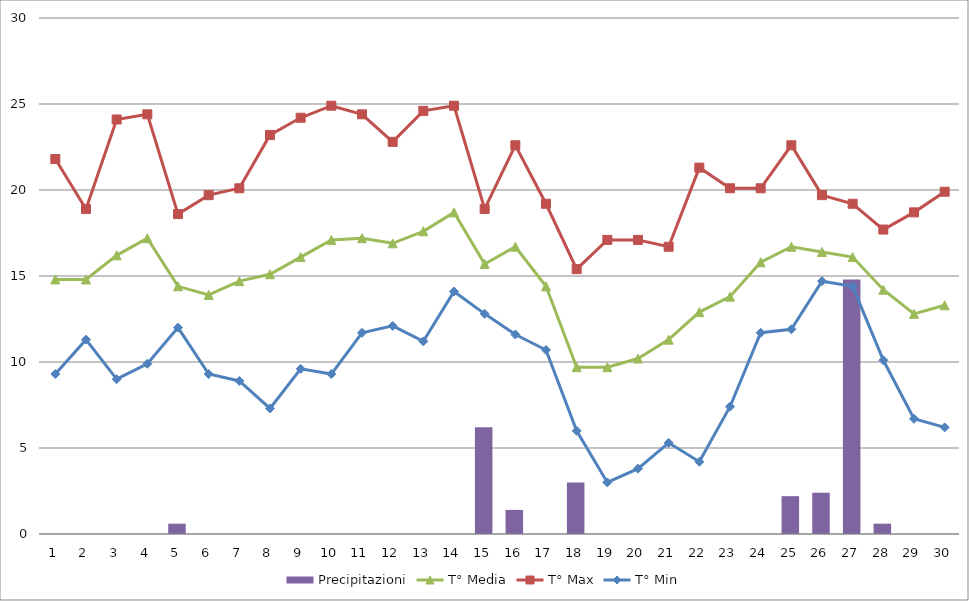
| Category | Precipitazioni |
|---|---|
| 0 | 0 |
| 1 | 0 |
| 2 | 0 |
| 3 | 0 |
| 4 | 0.6 |
| 5 | 0 |
| 6 | 0 |
| 7 | 0 |
| 8 | 0 |
| 9 | 0 |
| 10 | 0 |
| 11 | 0 |
| 12 | 0 |
| 13 | 0 |
| 14 | 6.2 |
| 15 | 1.4 |
| 16 | 0 |
| 17 | 3 |
| 18 | 0 |
| 19 | 0 |
| 20 | 0 |
| 21 | 0 |
| 22 | 0 |
| 23 | 0 |
| 24 | 2.2 |
| 25 | 2.4 |
| 26 | 14.8 |
| 27 | 0.6 |
| 28 | 0 |
| 29 | 0 |